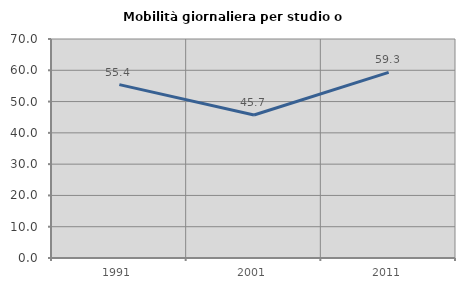
| Category | Mobilità giornaliera per studio o lavoro |
|---|---|
| 1991.0 | 55.409 |
| 2001.0 | 45.714 |
| 2011.0 | 59.317 |